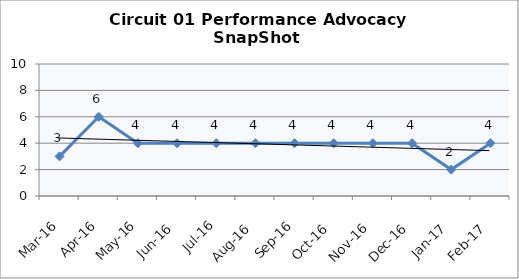
| Category | Circuit 01 |
|---|---|
| Mar-16 | 3 |
| Apr-16 | 6 |
| May-16 | 4 |
| Jun-16 | 4 |
| Jul-16 | 4 |
| Aug-16 | 4 |
| Sep-16 | 4 |
| Oct-16 | 4 |
| Nov-16 | 4 |
| Dec-16 | 4 |
| Jan-17 | 2 |
| Feb-17 | 4 |